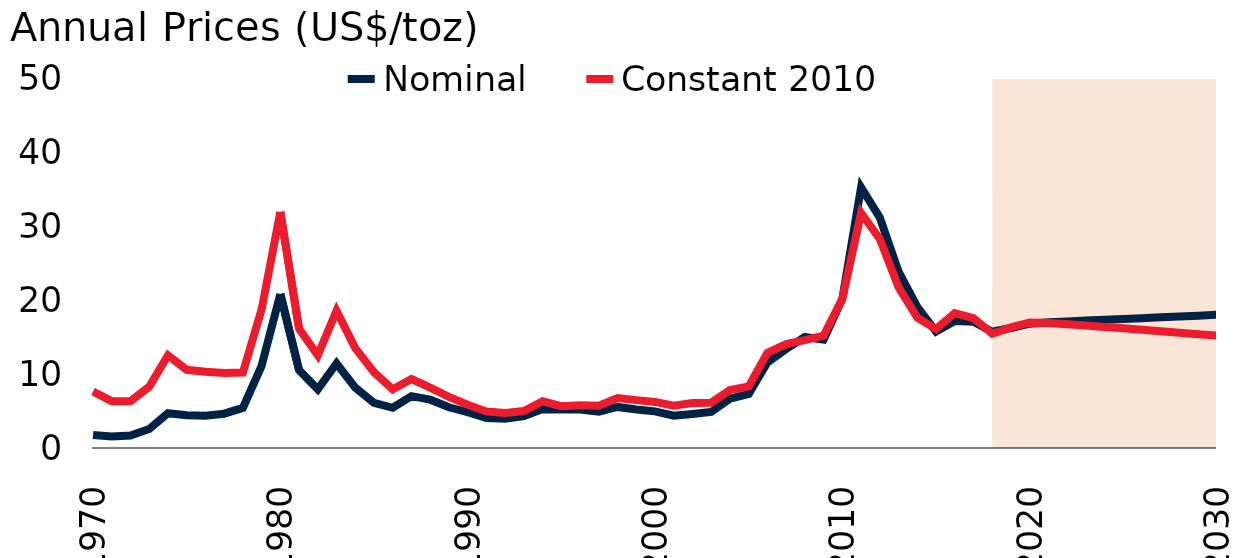
| Category | Nominal | Constant 2010 |
|---|---|---|
| 1970.0 | 1.771 | 7.628 |
| 1971.0 | 1.546 | 6.331 |
| 1972.0 | 1.685 | 6.325 |
| 1973.0 | 2.558 | 8.28 |
| 1974.0 | 4.708 | 12.508 |
| 1975.0 | 4.419 | 10.57 |
| 1976.0 | 4.356 | 10.293 |
| 1977.0 | 4.636 | 10.135 |
| 1978.0 | 5.419 | 10.194 |
| 1979.0 | 11.1 | 18.718 |
| 1980.0 | 20.804 | 31.897 |
| 1981.0 | 10.523 | 16.115 |
| 1982.0 | 7.93 | 12.517 |
| 1983.0 | 11.426 | 18.527 |
| 1984.0 | 8.144 | 13.502 |
| 1985.0 | 6.115 | 10.245 |
| 1986.0 | 5.439 | 7.923 |
| 1987.0 | 7.01 | 9.318 |
| 1988.0 | 6.53 | 8.152 |
| 1989.0 | 5.507 | 6.916 |
| 1990.0 | 4.833 | 5.846 |
| 1991.0 | 4.051 | 4.946 |
| 1992.0 | 3.946 | 4.729 |
| 1993.0 | 4.308 | 4.991 |
| 1994.0 | 5.285 | 6.312 |
| 1995.0 | 5.2 | 5.657 |
| 1996.0 | 5.201 | 5.768 |
| 1997.0 | 4.906 | 5.71 |
| 1998.0 | 5.551 | 6.755 |
| 1999.0 | 5.215 | 6.471 |
| 2000.0 | 4.953 | 6.226 |
| 2001.0 | 4.376 | 5.715 |
| 2002.0 | 4.601 | 6.079 |
| 2003.0 | 4.876 | 6.125 |
| 2004.0 | 6.658 | 7.83 |
| 2005.0 | 7.308 | 8.333 |
| 2006.0 | 11.559 | 12.854 |
| 2007.0 | 13.392 | 14.033 |
| 2008.0 | 14.997 | 14.583 |
| 2009.0 | 14.644 | 15.181 |
| 2010.0 | 20.153 | 20.153 |
| 2011.0 | 35.224 | 31.735 |
| 2012.0 | 31.137 | 28.262 |
| 2013.0 | 23.85 | 21.742 |
| 2014.0 | 19.072 | 17.623 |
| 2015.0 | 15.721 | 16.065 |
| 2016.0 | 17.147 | 18.235 |
| 2017.0 | 17.066 | 17.536 |
| 2018.0 | 15.714 | 15.439 |
| 2019.0 | 16.218 | 16.303 |
| 2020.0 | 16.8 | 16.971 |
| 2021.0 | 17 | 16.904 |
| 2022.0 | 17.108 | 16.731 |
| 2023.0 | 17.217 | 16.55 |
| 2024.0 | 17.327 | 16.364 |
| 2025.0 | 17.437 | 16.173 |
| 2026.0 | 17.548 | 15.979 |
| 2027.0 | 17.66 | 15.783 |
| 2028.0 | 17.773 | 15.584 |
| 2029.0 | 17.886 | 15.384 |
| 2030.0 | 18 | 15.182 |